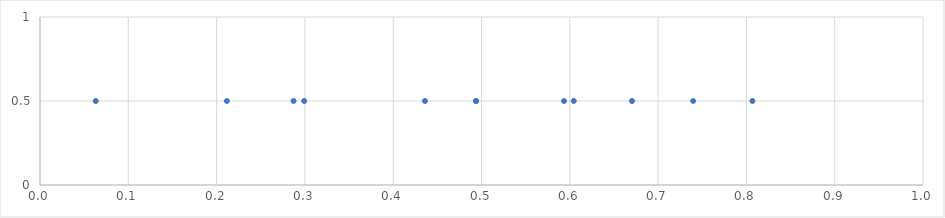
| Category | Series 0 |
|---|---|
| 0.6704214223050258 | 0.5 |
| 0.49363020763285914 | 0.5 |
| 0.604501595721651 | 0.5 |
| 0.06310740487572575 | 0.5 |
| 0.28714890495207257 | 0.5 |
| 0.5934454447856189 | 0.5 |
| 0.21163874412393802 | 0.5 |
| 0.43598605369399257 | 0.5 |
| 0.8068183011486386 | 0.5 |
| 0.49393245729891044 | 0.5 |
| 0.2991908947778549 | 0.5 |
| 0.7397121609893671 | 0.5 |